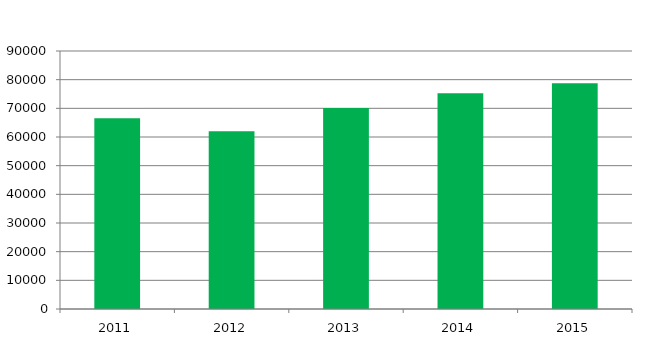
| Category |  General Government  |
|---|---|
| 2011.0 | 66553 |
| 2012.0 | 62003 |
| 2013.0 | 70091 |
| 2014.0 | 75264 |
| 2015.0 | 78783 |